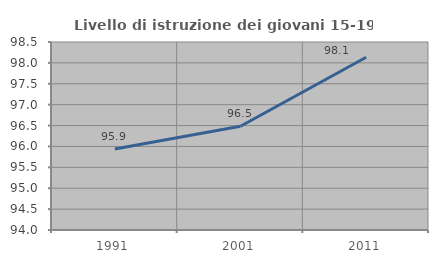
| Category | Livello di istruzione dei giovani 15-19 anni |
|---|---|
| 1991.0 | 95.937 |
| 2001.0 | 96.482 |
| 2011.0 | 98.136 |